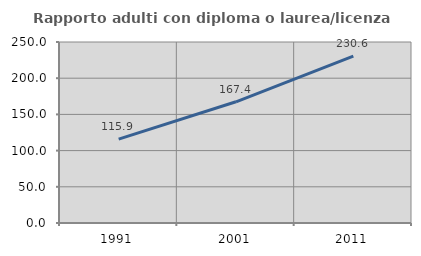
| Category | Rapporto adulti con diploma o laurea/licenza media  |
|---|---|
| 1991.0 | 115.898 |
| 2001.0 | 167.417 |
| 2011.0 | 230.608 |